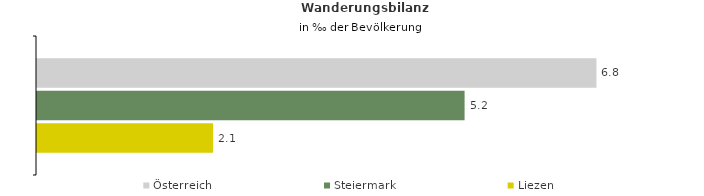
| Category | Österreich | Steiermark | Liezen |
|---|---|---|---|
| Wanderungsrate in ‰ der Bevölkerung, Periode 2015-2019 | 6.771 | 5.175 | 2.13 |